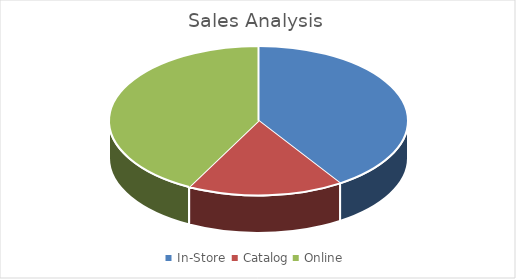
| Category | Series 0 |
|---|---|
| In-Store  | 105194.02 |
| Catalog | 43439.22 |
| Online | 109078.61 |